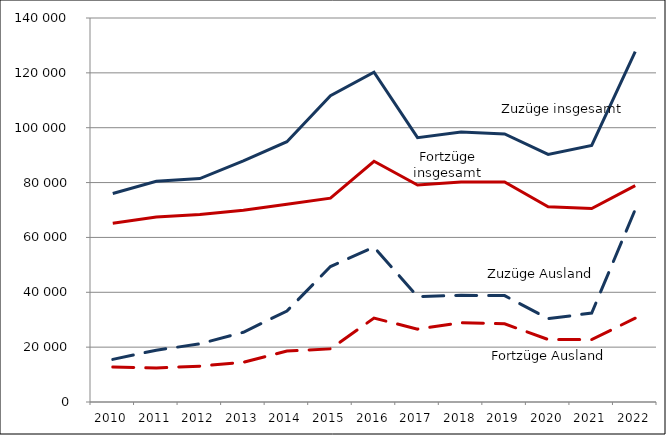
| Category | Zuzüge insgesamt | Zuzüge Ausland | Fortzüge insgesamt | Fortzüge Ausland |
|---|---|---|---|---|
| 2010.0 | 76032 | 15542 | 65209 | 12763 |
| 2011.0 | 80446 | 18887 | 67433 | 12401 |
| 2012.0 | 81472 | 21188 | 68334 | 13076 |
| 2013.0 | 87939 | 25439 | 69872 | 14506 |
| 2014.0 | 94900 | 33167 | 72104 | 18593 |
| 2015.0 | 111661 | 49379 | 74317 | 19376 |
| 2016.0 | 120235 | 56476 | 87754 | 30599 |
| 2017.0 | 96375 | 38438 | 79097 | 26566 |
| 2018.0 | 98424 | 38891 | 80217 | 28929 |
| 2019.0 | 97716 | 38791 | 80195 | 28497 |
| 2020.0 | 90243 | 30375 | 71178 | 22794 |
| 2021.0 | 93568 | 32423 | 70554 | 22771 |
| 2022.0 | 127720 | 70168 | 78895 | 30552 |